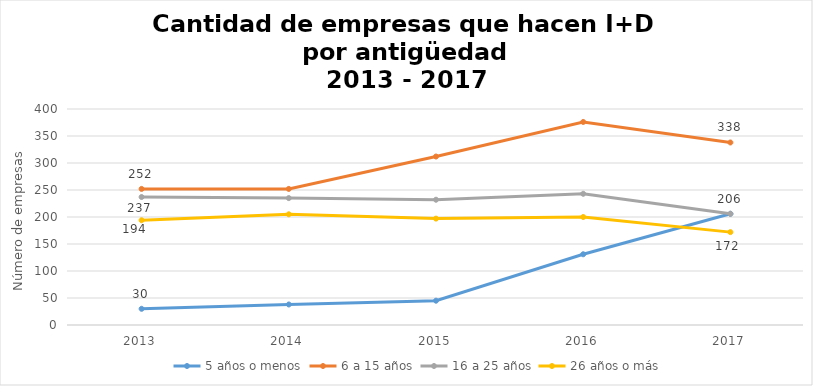
| Category | 5 años o menos | 6 a 15 años | 16 a 25 años | 26 años o más |
|---|---|---|---|---|
| 2013.0 | 30 | 252 | 237 | 194 |
| 2014.0 | 38 | 252 | 235 | 205 |
| 2015.0 | 45 | 312 | 232 | 197 |
| 2016.0 | 131 | 376 | 243 | 200 |
| 2017.0 | 206 | 338 | 206 | 172 |